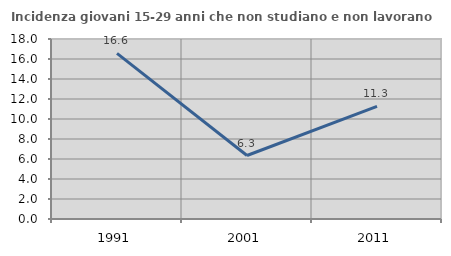
| Category | Incidenza giovani 15-29 anni che non studiano e non lavorano  |
|---|---|
| 1991.0 | 16.561 |
| 2001.0 | 6.349 |
| 2011.0 | 11.268 |